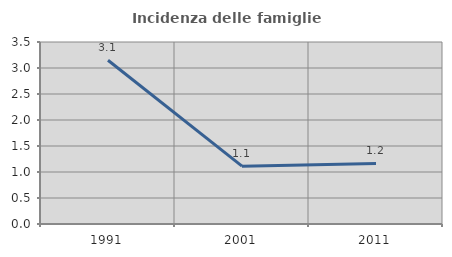
| Category | Incidenza delle famiglie numerose |
|---|---|
| 1991.0 | 3.15 |
| 2001.0 | 1.113 |
| 2011.0 | 1.164 |